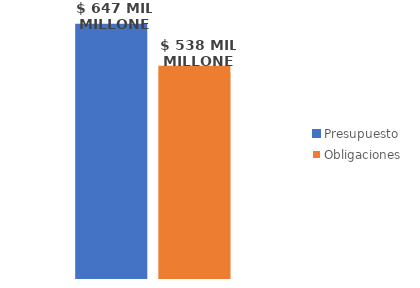
| Category | Presupuesto | Obligaciones |
|---|---|---|
| Total | 647348962443.013 | 537602830772.72 |